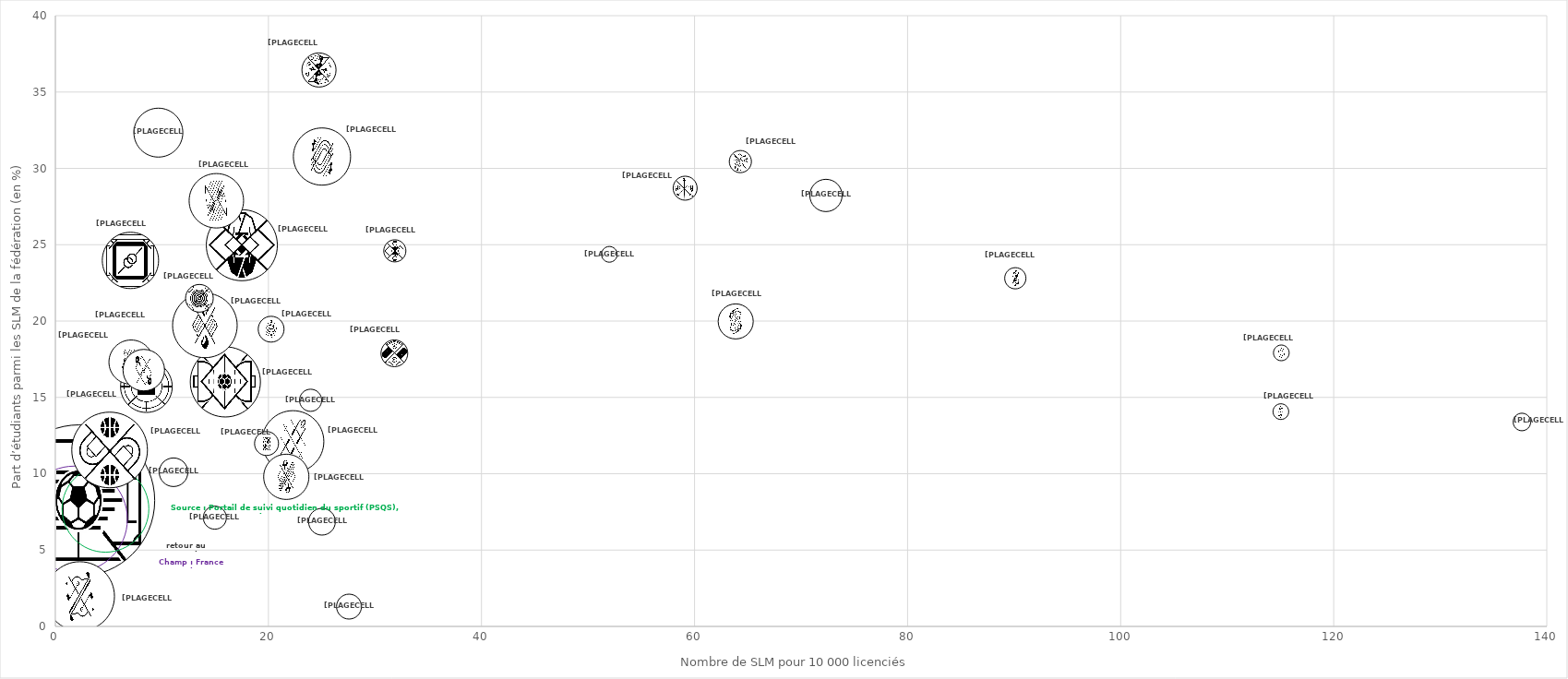
| Category | Series 0 |
|---|---|
| 2.220558238012859 | 8.245 |
| 1.7710569093238009 | 7.027 |
| 4.679403116135853 | 7.716 |
| 5.076594060006099 | 11.567 |
| 17.502494265321612 | 24.97 |
| 15.944116312768948 | 16.022 |
| 2.285269514730938 | 1.98 |
| 14.003095421093084 | 19.737 |
| 22.28361585774867 | 12.117 |
| 25.017928964945153 | 30.779 |
| 7.005057651624473 | 24 |
| 15.078800695486413 | 27.901 |
| 2.278985851296173 | 6.667 |
| 8.53450377956596 | 15.714 |
| 9.628981839833283 | 32.367 |
| 21.638768824911292 | 9.824 |
| 7.090020935101186 | 17.323 |
| 8.285213739540708 | 16.794 |
| 9.931340809208777 | 17.323 |
| 63.829011197432244 | 20 |
| 24.706429484943612 | 36.471 |
| 72.3000940225438 | 28.251 |
| 10.436836539914033 | 31.579 |
| 11.050032870350943 | 10.127 |
| 13.498214752242445 | 21.505 |
| 24.998828179929067 | 6.875 |
| 31.788205152535937 | 17.91 |
| 20.21621065976803 | 19.492 |
| 27.53822740778317 | 1.316 |
| 59.10503536769052 | 28.71 |
| 19.79139865814317 | 12 |
| 7.447215345289132 | 8.108 |
| 14.939388765579649 | 7.143 |
| 23.952095808383234 | 14.815 |
| 64.2922293163667 | 30.45 |
| 31.823687272899992 | 24.627 |
| 11.135581896018412 | 11.111 |
| 8.823376758187575 | 5.882 |
| 90.06898346999868 | 22.832 |
| 13.368577765624524 | 34.091 |
| 137.64345547806192 | 13.405 |
| 52.00367084735393 | 24.37 |
| 115.03805441343714 | 14.068 |
| 4.07147704139335 | 11.111 |
| 115.06372054643806 | 17.928 |